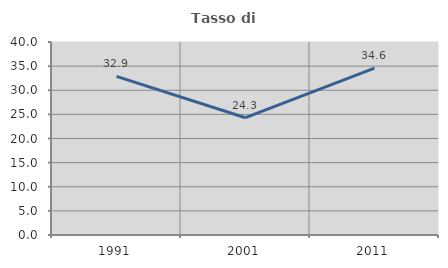
| Category | Tasso di occupazione   |
|---|---|
| 1991.0 | 32.87 |
| 2001.0 | 24.309 |
| 2011.0 | 34.591 |